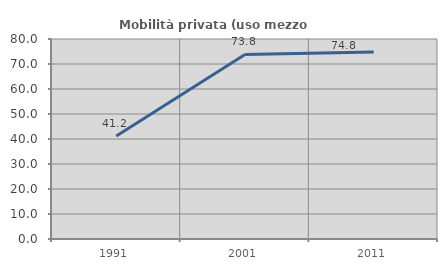
| Category | Mobilità privata (uso mezzo privato) |
|---|---|
| 1991.0 | 41.228 |
| 2001.0 | 73.832 |
| 2011.0 | 74.79 |